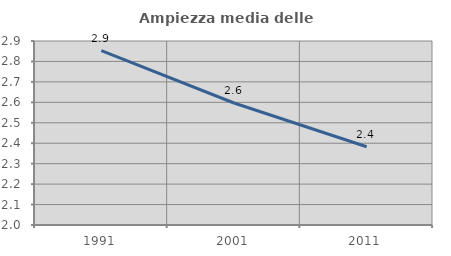
| Category | Ampiezza media delle famiglie |
|---|---|
| 1991.0 | 2.853 |
| 2001.0 | 2.597 |
| 2011.0 | 2.383 |